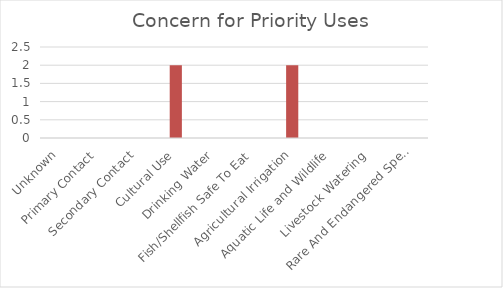
| Category | Series 0 |
|---|---|
| Unknown | 0 |
| Primary Contact | 0 |
| Secondary Contact | 0 |
| Cultural Use | 2 |
| Drinking Water | 0 |
| Fish/Shellfish Safe To Eat | 0 |
| Agricultural Irrigation | 2 |
| Aquatic Life and Wildlife | 0 |
| Livestock Watering | 0 |
| Rare And Endangered Species | 0 |